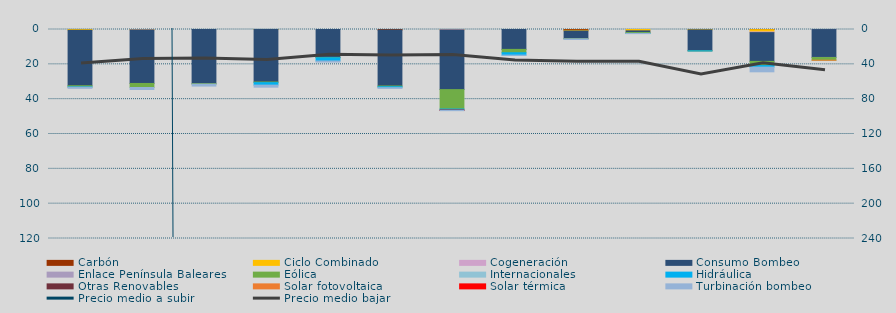
| Category | Carbón | Ciclo Combinado | Cogeneración | Consumo Bombeo | Enlace Península Baleares | Eólica | Internacionales | Hidráulica | Otras Renovables | Solar fotovoltaica | Solar térmica | Turbinación bombeo |
|---|---|---|---|---|---|---|---|---|---|---|---|---|
| 0 | 0 | 458.3 | 0 | 31829.7 | 0 | 671.7 |  | 189.5 | 0 | 0 | 0 | 613.5 |
| 1 | 0 | 223.8 | 2.4 | 30752.2 | 0 | 2324.3 |  | 0 | 0 | 0 | 0 | 1135.9 |
| 2 | 0 | 0 | 0 | 31097.5 | 0 | 268.5 |  | 0 | 0 | 0 | 0 | 1121.8 |
| 3 | 0 | 20 | 0 | 30123.6 | 0 | 373.8 |  | 1416.6 | 0 | 0 | 0 | 1190.9 |
| 4 | 0 | 0 | 0 | 16053.6 | 0 | 185.3 |  | 1837.6 | 0 | 0 | 0 | 606.6 |
| 5 | 350.4 | 0 | 0 | 32084.5 | 0 | 425.7 |  | 531.2 | 0 | 0 | 0 | 413.1 |
| 6 | 0 | 90 | 154.4 | 34261.7 | 0 | 11163.7 |  | 589.5 | 122.2 | 0 | 44.1 | 171.5 |
| 7 | 0 | 0 | 0 | 11426.8 | 0 | 1911.2 |  | 1375.3 | 0 | 0 | 0 | 67.5 |
| 8 | 482 | 368.5 | 0 | 4415 | 0 | 113.2 |  | 0 | 0 | 0 | 0 | 368.4 |
| 9 | 0 | 796.6 | 0 | 914.2 | 0 | 550.1 |  | 8.9 | 0 | 0 | 0 | 104 |
| 10 | 0 | 211.3 | 0 | 11981.8 | 0 | 74 |  | 8.3 | 0 | 0 | 0 | 0 |
| 11 | 91.8 | 1302.4 | 400.2 | 16524.6 | 0 | 2415.4 |  | 873.5 | 0 | 0 | 0 | 2690.2 |
| 12 | 0 | 0 | 27.2 | 16019.9 | 60 | 1518.5 |  | 0 | 0 | 0.9 | 0 | 0 |